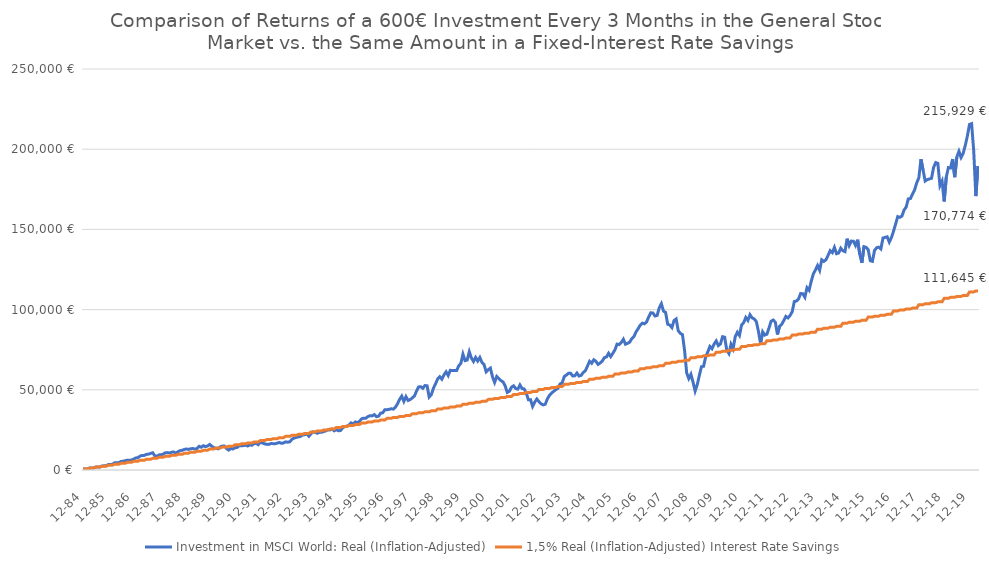
| Category | Investment in MSCI World: Real (Inflation-Adjusted) | 1,5% Real (Inflation-Adjusted) Interest Rate Savings |
|---|---|---|
| 1984-12-31 | 600 | 600 |
| 1985-01-31 | 605.062 | 600 |
| 1985-02-28 | 590.574 | 600 |
| 1985-03-29 | 1201.66 | 1200 |
| 1985-04-30 | 1184.98 | 1200 |
| 1985-05-31 | 1241.666 | 1200 |
| 1985-06-28 | 1861.653 | 1800 |
| 1985-07-31 | 1893.3 | 1800 |
| 1985-08-30 | 1893.676 | 1800 |
| 1985-09-30 | 2505.155 | 2400 |
| 1985-10-31 | 2613.472 | 2400 |
| 1985-11-29 | 2716.747 | 2400 |
| 1985-12-31 | 3397.392 | 3022.458 |
| 1986-01-31 | 3358.671 | 3022.458 |
| 1986-02-28 | 3613.473 | 3022.458 |
| 1986-03-31 | 4520.52 | 3622.458 |
| 1986-04-30 | 4584.732 | 3622.458 |
| 1986-05-30 | 4591.055 | 3622.458 |
| 1986-06-30 | 5358.942 | 4222.458 |
| 1986-07-31 | 5401.009 | 4222.458 |
| 1986-08-29 | 5817.216 | 4222.458 |
| 1986-09-30 | 6161.621 | 4822.458 |
| 1986-10-31 | 6015.929 | 4822.458 |
| 1986-11-28 | 6216.125 | 4822.458 |
| 1986-12-31 | 6834.803 | 5481.253 |
| 1987-01-30 | 7522.57 | 5481.253 |
| 1987-02-27 | 7680.002 | 5481.253 |
| 1987-03-31 | 8645.275 | 6081.253 |
| 1987-04-30 | 9104.373 | 6081.253 |
| 1987-05-29 | 9105.243 | 6081.253 |
| 1987-06-30 | 9722.304 | 6681.253 |
| 1987-07-31 | 9883.754 | 6681.253 |
| 1987-08-31 | 10354.941 | 6681.253 |
| 1987-09-30 | 10744.263 | 7281.253 |
| 1987-10-30 | 8818.941 | 7281.253 |
| 1987-11-30 | 8570.288 | 7281.253 |
| 1987-12-31 | 9418.919 | 7976.93 |
| 1988-01-29 | 9509.69 | 7976.93 |
| 1988-02-29 | 9921.6 | 7976.93 |
| 1988-03-31 | 10750.277 | 8576.93 |
| 1988-04-29 | 10842.546 | 8576.93 |
| 1988-05-31 | 10587.322 | 8576.93 |
| 1988-06-30 | 11114.72 | 9176.93 |
| 1988-07-29 | 11228.586 | 9176.93 |
| 1988-08-31 | 10471.45 | 9176.93 |
| 1988-09-30 | 11402.178 | 9776.93 |
| 1988-10-31 | 12050.984 | 9776.93 |
| 1988-11-30 | 12294.247 | 9776.93 |
| 1988-12-30 | 12857.11 | 10510.042 |
| 1989-01-31 | 13086.198 | 10510.042 |
| 1989-02-28 | 12828.686 | 10510.042 |
| 1989-03-31 | 13235.124 | 11110.042 |
| 1989-04-28 | 13400.24 | 11110.042 |
| 1989-05-31 | 13045.169 | 11110.042 |
| 1989-06-30 | 13408.574 | 11710.042 |
| 1989-07-31 | 14782.078 | 11710.042 |
| 1989-08-31 | 14186.915 | 11710.042 |
| 1989-09-29 | 15152.467 | 12310.042 |
| 1989-10-31 | 14570.886 | 12310.042 |
| 1989-11-30 | 15008.349 | 12310.042 |
| 1989-12-29 | 15925.84 | 13081.151 |
| 1990-01-31 | 14822.213 | 13081.151 |
| 1990-02-28 | 13873.331 | 13081.151 |
| 1990-03-30 | 13555.672 | 13681.151 |
| 1990-04-30 | 13203.836 | 13681.151 |
| 1990-05-31 | 14436.955 | 13681.151 |
| 1990-06-29 | 14887.888 | 14281.151 |
| 1990-07-31 | 14913.386 | 14281.151 |
| 1990-08-31 | 13354.347 | 14281.151 |
| 1990-09-28 | 12416.198 | 14881.151 |
| 1990-10-31 | 13424.508 | 14881.151 |
| 1990-11-30 | 13113.976 | 14881.151 |
| 1990-12-31 | 13881.274 | 15690.826 |
| 1991-01-31 | 14077.93 | 15690.826 |
| 1991-02-28 | 15118.82 | 15690.826 |
| 1991-03-29 | 15187.468 | 16290.826 |
| 1991-04-30 | 15196.2 | 16290.826 |
| 1991-05-31 | 15423.518 | 16290.826 |
| 1991-06-28 | 14971.401 | 16890.826 |
| 1991-07-31 | 15602.739 | 16890.826 |
| 1991-08-30 | 15446.735 | 16890.826 |
| 1991-09-30 | 16416.601 | 17490.826 |
| 1991-10-31 | 16585.23 | 17490.826 |
| 1991-11-29 | 15780.325 | 17490.826 |
| 1991-12-31 | 17422.579 | 18339.647 |
| 1992-01-31 | 16802.56 | 18339.647 |
| 1992-02-28 | 16317.553 | 18339.647 |
| 1992-03-31 | 15996.602 | 18939.647 |
| 1992-04-30 | 15971.819 | 18939.647 |
| 1992-05-29 | 16458.941 | 18939.647 |
| 1992-06-30 | 16440.237 | 19539.647 |
| 1992-07-31 | 16406.702 | 19539.647 |
| 1992-08-31 | 16725.473 | 19539.647 |
| 1992-09-30 | 17164.115 | 20139.647 |
| 1992-10-30 | 16636.294 | 20139.647 |
| 1992-11-30 | 16872.776 | 20139.647 |
| 1992-12-31 | 17537.962 | 21028.2 |
| 1993-01-29 | 17342.277 | 21028.2 |
| 1993-02-26 | 17616.429 | 21028.2 |
| 1993-03-31 | 19158.078 | 21628.2 |
| 1993-04-30 | 19928.012 | 21628.2 |
| 1993-05-31 | 20287.058 | 21628.2 |
| 1993-06-30 | 20665.769 | 22228.2 |
| 1993-07-30 | 20963.037 | 22228.2 |
| 1993-08-31 | 21834.155 | 22228.2 |
| 1993-09-30 | 21964.658 | 22828.2 |
| 1993-10-29 | 22444.656 | 22828.2 |
| 1993-11-30 | 21038.866 | 22828.2 |
| 1993-12-31 | 22606.88 | 23757.081 |
| 1994-01-31 | 23801.88 | 23757.081 |
| 1994-02-28 | 23360.07 | 23757.081 |
| 1994-03-31 | 22896.9 | 24357.081 |
| 1994-04-29 | 23466.65 | 24357.081 |
| 1994-05-31 | 23468.999 | 24357.081 |
| 1994-06-30 | 23965.684 | 24957.081 |
| 1994-07-29 | 24374.611 | 24957.081 |
| 1994-08-31 | 25056.791 | 24957.081 |
| 1994-09-30 | 24970.611 | 25557.081 |
| 1994-10-31 | 25576.377 | 25557.081 |
| 1994-11-30 | 24413.886 | 25557.081 |
| 1994-12-30 | 25169.798 | 26526.895 |
| 1995-01-31 | 24436.562 | 26526.895 |
| 1995-02-28 | 24646.366 | 26526.895 |
| 1995-03-31 | 26308.61 | 27126.895 |
| 1995-04-28 | 27102.594 | 27126.895 |
| 1995-05-31 | 27349.413 | 27126.895 |
| 1995-06-30 | 27993.247 | 27726.895 |
| 1995-07-31 | 29378.013 | 27726.895 |
| 1995-08-31 | 28598.583 | 27726.895 |
| 1995-09-29 | 29985.52 | 28326.895 |
| 1995-10-31 | 29406.041 | 28326.895 |
| 1995-11-30 | 30399.209 | 28326.895 |
| 1995-12-29 | 31913.727 | 29338.257 |
| 1996-01-31 | 32333.643 | 29338.257 |
| 1996-02-29 | 32333.809 | 29338.257 |
| 1996-03-29 | 33349.315 | 29938.257 |
| 1996-04-30 | 33854.701 | 29938.257 |
| 1996-05-31 | 33750.05 | 29938.257 |
| 1996-06-28 | 34529.672 | 30538.257 |
| 1996-07-31 | 33253.185 | 30538.257 |
| 1996-08-30 | 33530.336 | 30538.257 |
| 1996-09-30 | 35439.847 | 31138.257 |
| 1996-10-31 | 35699.903 | 31138.257 |
| 1996-11-29 | 37623.905 | 31138.257 |
| 1996-12-31 | 37596.685 | 32191.789 |
| 1997-01-31 | 37813.355 | 32191.789 |
| 1997-02-28 | 38176.307 | 32191.789 |
| 1997-03-31 | 37964.979 | 32791.789 |
| 1997-04-30 | 39135.869 | 32791.789 |
| 1997-05-30 | 41293.463 | 32791.789 |
| 1997-06-30 | 44060.277 | 33391.789 |
| 1997-07-31 | 46069.523 | 33391.789 |
| 1997-08-29 | 42775.438 | 33391.789 |
| 1997-09-30 | 45720.383 | 33991.789 |
| 1997-10-31 | 43330.087 | 33991.789 |
| 1997-11-28 | 43915.041 | 33991.789 |
| 1997-12-31 | 44938.419 | 35088.124 |
| 1998-01-30 | 46121.063 | 35088.124 |
| 1998-02-27 | 49255.55 | 35088.124 |
| 1998-03-31 | 51789.84 | 35688.124 |
| 1998-04-30 | 51917.334 | 35688.124 |
| 1998-05-29 | 50941.523 | 35688.124 |
| 1998-06-30 | 52675.89 | 36288.124 |
| 1998-07-31 | 52474.399 | 36288.124 |
| 1998-08-31 | 45461.168 | 36288.124 |
| 1998-09-30 | 46912.684 | 36888.124 |
| 1998-10-30 | 50963.458 | 36888.124 |
| 1998-11-30 | 53721.828 | 36888.124 |
| 1998-12-31 | 56740.147 | 38027.904 |
| 1999-01-29 | 58165.766 | 38027.904 |
| 1999-02-26 | 56591.844 | 38027.904 |
| 1999-03-31 | 59289.001 | 38627.904 |
| 1999-04-30 | 61228.331 | 38627.904 |
| 1999-05-31 | 58912.839 | 38627.904 |
| 1999-06-30 | 62157.959 | 39227.904 |
| 1999-07-30 | 61976.917 | 39227.904 |
| 1999-08-31 | 61954.921 | 39227.904 |
| 1999-09-30 | 61959.449 | 39827.904 |
| 1999-10-29 | 64993.012 | 39827.904 |
| 1999-11-30 | 66425.869 | 39827.904 |
| 1999-12-31 | 72215.965 | 41011.78 |
| 2000-01-31 | 68205.72 | 41011.78 |
| 2000-02-29 | 68537.786 | 41011.78 |
| 2000-03-31 | 73756.05 | 41611.78 |
| 2000-04-28 | 69814.94 | 41611.78 |
| 2000-05-31 | 67657.989 | 41611.78 |
| 2000-06-30 | 70179.652 | 42211.78 |
| 2000-07-31 | 67972.179 | 42211.78 |
| 2000-08-31 | 70147.353 | 42211.78 |
| 2000-09-29 | 67069.224 | 42811.78 |
| 2000-10-31 | 65669.7 | 42811.78 |
| 2000-11-30 | 61191.013 | 42811.78 |
| 2000-12-29 | 62542.322 | 44040.415 |
| 2001-01-31 | 63513.017 | 44040.415 |
| 2001-02-28 | 58066.912 | 44040.415 |
| 2001-03-30 | 54606.178 | 44640.415 |
| 2001-04-30 | 58302.299 | 44640.415 |
| 2001-05-31 | 57065.43 | 44640.415 |
| 2001-06-29 | 55725.682 | 45240.415 |
| 2001-07-31 | 54919.002 | 45240.415 |
| 2001-08-31 | 52375.734 | 45240.415 |
| 2001-09-28 | 48370.32 | 45840.415 |
| 2001-10-31 | 49103.709 | 45840.415 |
| 2001-11-30 | 51657.831 | 45840.415 |
| 2001-12-31 | 52475.573 | 47114.479 |
| 2002-01-31 | 50799.195 | 47114.479 |
| 2002-02-28 | 50439.407 | 47114.479 |
| 2002-03-29 | 53035.095 | 47714.479 |
| 2002-04-30 | 50819.895 | 47714.479 |
| 2002-05-31 | 50570.92 | 47714.479 |
| 2002-06-28 | 47941.042 | 48314.479 |
| 2002-07-31 | 43820.739 | 48314.479 |
| 2002-08-30 | 43863.227 | 48314.479 |
| 2002-09-30 | 39656.793 | 48914.479 |
| 2002-10-31 | 42306.108 | 48914.479 |
| 2002-11-29 | 44259.753 | 48914.479 |
| 2002-12-31 | 42651.293 | 50234.655 |
| 2003-01-31 | 41290.547 | 50234.655 |
| 2003-02-28 | 40574.385 | 50234.655 |
| 2003-03-31 | 41012.139 | 50834.655 |
| 2003-04-30 | 44305.874 | 50834.655 |
| 2003-05-30 | 46566.139 | 50834.655 |
| 2003-06-30 | 47968.483 | 51434.655 |
| 2003-07-31 | 49080.947 | 51434.655 |
| 2003-08-29 | 50110.949 | 51434.655 |
| 2003-09-30 | 50917.148 | 52034.655 |
| 2003-10-31 | 53642.104 | 52034.655 |
| 2003-11-28 | 54302.207 | 52034.655 |
| 2003-12-31 | 58271.494 | 53401.633 |
| 2004-01-30 | 59202.956 | 53401.633 |
| 2004-02-27 | 60285.653 | 53401.633 |
| 2004-03-31 | 60347.493 | 54001.633 |
| 2004-04-30 | 58612.98 | 54001.633 |
| 2004-05-31 | 58762.727 | 54001.633 |
| 2004-06-30 | 60434.515 | 54601.633 |
| 2004-07-30 | 58571.989 | 54601.633 |
| 2004-08-31 | 59034.753 | 54601.633 |
| 2004-09-30 | 60799.421 | 55201.633 |
| 2004-10-29 | 61887.961 | 55201.633 |
| 2004-11-30 | 64784.924 | 55201.633 |
| 2004-12-31 | 67805.892 | 56616.115 |
| 2005-01-31 | 66581.568 | 56616.115 |
| 2005-02-28 | 68719.898 | 56616.115 |
| 2005-03-31 | 67756.331 | 57216.115 |
| 2005-04-29 | 65832.115 | 57216.115 |
| 2005-05-31 | 66723.794 | 57216.115 |
| 2005-06-30 | 67884.71 | 57816.115 |
| 2005-07-29 | 70045.249 | 57816.115 |
| 2005-08-31 | 70495.475 | 57816.115 |
| 2005-09-30 | 72787.84 | 58416.115 |
| 2005-10-31 | 70691.274 | 58416.115 |
| 2005-11-30 | 72741.457 | 58416.115 |
| 2005-12-30 | 74879.894 | 59878.815 |
| 2006-01-31 | 78487.416 | 59878.815 |
| 2006-02-28 | 78209.926 | 59878.815 |
| 2006-03-31 | 79533.598 | 60478.815 |
| 2006-04-28 | 81526.983 | 60478.815 |
| 2006-05-31 | 78405.14 | 60478.815 |
| 2006-06-30 | 79019.04 | 61078.815 |
| 2006-07-31 | 79697.084 | 61078.815 |
| 2006-08-31 | 81891.823 | 61078.815 |
| 2006-09-29 | 83123.819 | 61678.815 |
| 2006-10-31 | 86113.904 | 61678.815 |
| 2006-11-30 | 88103.313 | 61678.815 |
| 2006-12-29 | 90295.978 | 63190.455 |
| 2007-01-31 | 91612.346 | 63190.455 |
| 2007-02-28 | 91150.929 | 63190.455 |
| 2007-03-30 | 92274.752 | 63790.455 |
| 2007-04-30 | 95471.717 | 63790.455 |
| 2007-05-31 | 98004.055 | 63790.455 |
| 2007-06-29 | 97898.129 | 64390.455 |
| 2007-07-31 | 96007.322 | 64390.455 |
| 2007-08-31 | 96390.328 | 64390.455 |
| 2007-09-28 | 101124.269 | 64990.455 |
| 2007-10-31 | 103655.948 | 64990.455 |
| 2007-11-30 | 99075.061 | 64990.455 |
| 2007-12-31 | 98286.346 | 66551.77 |
| 2008-01-31 | 90889.915 | 66551.77 |
| 2008-02-29 | 90355.009 | 66551.77 |
| 2008-03-31 | 88783.431 | 67151.77 |
| 2008-04-30 | 93158.118 | 67151.77 |
| 2008-05-30 | 94166.071 | 67151.77 |
| 2008-06-30 | 86823.602 | 67751.77 |
| 2008-07-31 | 85195.447 | 67751.77 |
| 2008-08-29 | 84424.82 | 67751.77 |
| 2008-09-30 | 74588.4 | 68351.77 |
| 2008-10-31 | 60539.805 | 68351.77 |
| 2008-11-28 | 56984.44 | 68351.77 |
| 2008-12-31 | 59694.226 | 69963.505 |
| 2009-01-30 | 54816.893 | 69963.505 |
| 2009-02-27 | 49232.063 | 69963.505 |
| 2009-03-31 | 53127.16 | 70563.505 |
| 2009-04-30 | 58939.645 | 70563.505 |
| 2009-05-29 | 64405.871 | 70563.505 |
| 2009-06-30 | 64667.034 | 71163.505 |
| 2009-07-31 | 70518.866 | 71163.505 |
| 2009-08-31 | 73641.546 | 71163.505 |
| 2009-09-30 | 77029.231 | 71763.505 |
| 2009-10-30 | 75616.231 | 71763.505 |
| 2009-11-30 | 78520.921 | 71763.505 |
| 2009-12-31 | 80475.755 | 73426.416 |
| 2010-01-29 | 77522.54 | 73426.416 |
| 2010-02-26 | 78588.945 | 73426.416 |
| 2010-03-31 | 83098.71 | 74026.416 |
| 2010-04-30 | 82773.493 | 74026.416 |
| 2010-05-31 | 74743.518 | 74026.416 |
| 2010-06-30 | 72643.473 | 74626.416 |
| 2010-07-30 | 78399.531 | 74626.416 |
| 2010-08-31 | 75623.374 | 74626.416 |
| 2010-09-30 | 83123.979 | 75226.416 |
| 2010-10-29 | 85856.083 | 75226.416 |
| 2010-11-30 | 83855.348 | 75226.416 |
| 2010-12-31 | 90357.529 | 76941.27 |
| 2011-01-31 | 91870.137 | 76941.27 |
| 2011-02-28 | 95091.753 | 76941.27 |
| 2011-03-31 | 93263.029 | 77541.27 |
| 2011-04-29 | 96817.374 | 77541.27 |
| 2011-05-31 | 94857.496 | 77541.27 |
| 2011-06-30 | 94173.809 | 78141.27 |
| 2011-07-29 | 92535.685 | 78141.27 |
| 2011-08-31 | 86394.587 | 78141.27 |
| 2011-09-30 | 78894.207 | 78741.27 |
| 2011-10-31 | 86149.535 | 78741.27 |
| 2011-11-30 | 84112.702 | 78741.27 |
| 2011-12-30 | 84680.481 | 80508.847 |
| 2012-01-31 | 88507.596 | 80508.847 |
| 2012-02-29 | 92756.087 | 80508.847 |
| 2012-03-30 | 93465.47 | 81108.847 |
| 2012-04-30 | 92144.712 | 81108.847 |
| 2012-05-31 | 84486.438 | 81108.847 |
| 2012-06-29 | 89586.129 | 81708.847 |
| 2012-07-31 | 90752.333 | 81708.847 |
| 2012-08-31 | 93185.55 | 81708.847 |
| 2012-09-28 | 95752.277 | 82308.847 |
| 2012-10-31 | 94807.612 | 82308.847 |
| 2012-11-30 | 96324.946 | 82308.847 |
| 2012-12-31 | 98724.728 | 84129.938 |
| 2013-01-31 | 105059.003 | 84129.938 |
| 2013-02-28 | 105358.959 | 84129.938 |
| 2013-03-29 | 106673.999 | 84729.938 |
| 2013-04-30 | 110021.17 | 84729.938 |
| 2013-05-31 | 109874.928 | 84729.938 |
| 2013-06-28 | 107712.369 | 85329.938 |
| 2013-07-31 | 113651.065 | 85329.938 |
| 2013-08-30 | 112062.78 | 85329.938 |
| 2013-09-30 | 117582.223 | 85929.938 |
| 2013-10-31 | 122244.426 | 85929.938 |
| 2013-11-29 | 124693.781 | 85929.938 |
| 2013-12-31 | 127473.9 | 87805.345 |
| 2014-01-31 | 124466.673 | 87805.345 |
| 2014-02-28 | 131039.802 | 87805.345 |
| 2014-03-31 | 130062.627 | 88405.345 |
| 2014-04-30 | 131085.486 | 88405.345 |
| 2014-05-30 | 133835.059 | 88405.345 |
| 2014-06-30 | 136732.965 | 89005.345 |
| 2014-07-31 | 135485.516 | 89005.345 |
| 2014-08-29 | 138786.774 | 89005.345 |
| 2014-09-30 | 134852.456 | 89605.345 |
| 2014-10-31 | 135278.827 | 89605.345 |
| 2014-11-28 | 138276.306 | 89605.345 |
| 2014-12-31 | 136668.321 | 91535.884 |
| 2015-01-30 | 136115.375 | 91535.884 |
| 2015-02-27 | 144198.214 | 91535.884 |
| 2015-03-31 | 139907.71 | 92135.884 |
| 2015-04-30 | 142726.343 | 92135.884 |
| 2015-05-29 | 142610.198 | 92135.884 |
| 2015-06-30 | 140005.596 | 92735.884 |
| 2015-07-31 | 143559.397 | 92735.884 |
| 2015-08-31 | 134510.367 | 92735.884 |
| 2015-09-30 | 129135.487 | 93335.884 |
| 2015-10-30 | 139244.581 | 93335.884 |
| 2015-11-30 | 138825.169 | 93335.884 |
| 2015-12-31 | 137341.487 | 95322.38 |
| 2016-01-29 | 130477.85 | 95322.38 |
| 2016-02-29 | 130089.536 | 95322.38 |
| 2016-03-31 | 136878.755 | 95922.38 |
| 2016-04-29 | 138559.186 | 95922.38 |
| 2016-05-31 | 138943.973 | 95922.38 |
| 2016-06-30 | 137804.958 | 96522.38 |
| 2016-07-29 | 144582.804 | 96522.38 |
| 2016-08-31 | 145027.026 | 96522.38 |
| 2016-09-30 | 145391.465 | 97122.38 |
| 2016-10-31 | 142091.106 | 97122.38 |
| 2016-11-30 | 144863.074 | 97122.38 |
| 2016-12-30 | 148870.954 | 99165.674 |
| 2017-01-31 | 153372.228 | 99165.674 |
| 2017-02-28 | 157990.663 | 99165.674 |
| 2017-03-31 | 157523.423 | 99765.674 |
| 2017-04-28 | 158346.853 | 99765.674 |
| 2017-05-31 | 162079.052 | 99765.674 |
| 2017-06-30 | 163959.89 | 100365.674 |
| 2017-07-31 | 169012.42 | 100365.674 |
| 2017-08-31 | 169237.245 | 100365.674 |
| 2017-09-29 | 172011.405 | 100965.674 |
| 2017-10-31 | 174660.297 | 100965.674 |
| 2017-11-30 | 179068.394 | 100965.674 |
| 2017-12-29 | 182167.61 | 103066.617 |
| 2018-01-31 | 193758.09 | 103066.617 |
| 2018-02-28 | 187000.663 | 103066.617 |
| 2018-03-30 | 180175.688 | 103666.617 |
| 2018-04-30 | 181050.512 | 103666.617 |
| 2018-05-31 | 181447.357 | 103666.617 |
| 2018-06-29 | 181844.241 | 104266.617 |
| 2018-07-31 | 188674.574 | 104266.617 |
| 2018-08-31 | 191671.047 | 104266.617 |
| 2018-09-28 | 191188.817 | 104866.617 |
| 2018-10-31 | 177309.712 | 104866.617 |
| 2018-11-30 | 180129.995 | 104866.617 |
| 2018-12-31 | 167424.988 | 107026.075 |
| 2019-01-31 | 182648.894 | 107026.075 |
| 2019-02-28 | 188557.204 | 107026.075 |
| 2019-03-29 | 188308.904 | 107626.075 |
| 2019-04-30 | 193852.813 | 107626.075 |
| 2019-05-31 | 182560.879 | 107626.075 |
| 2019-06-28 | 195131.313 | 108226.075 |
| 2019-07-31 | 198692.113 | 108226.075 |
| 2019-08-30 | 194852.305 | 108226.075 |
| 2019-09-30 | 197432.561 | 108826.075 |
| 2019-10-31 | 202381.09 | 108826.075 |
| 2019-11-29 | 208324.681 | 108826.075 |
| 2019-12-31 | 215450.304 | 111044.924 |
| 2020-01-31 | 215929.019 | 111044.924 |
| 2020-02-28 | 198943.841 | 111044.924 |
| 2020-03-31 | 170774.475 | 111644.924 |
| 2020-04-30 | 189430.596 | 111644.924 |